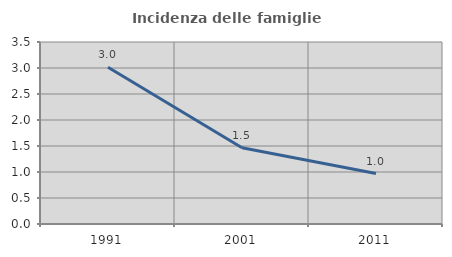
| Category | Incidenza delle famiglie numerose |
|---|---|
| 1991.0 | 3.015 |
| 2001.0 | 1.467 |
| 2011.0 | 0.971 |